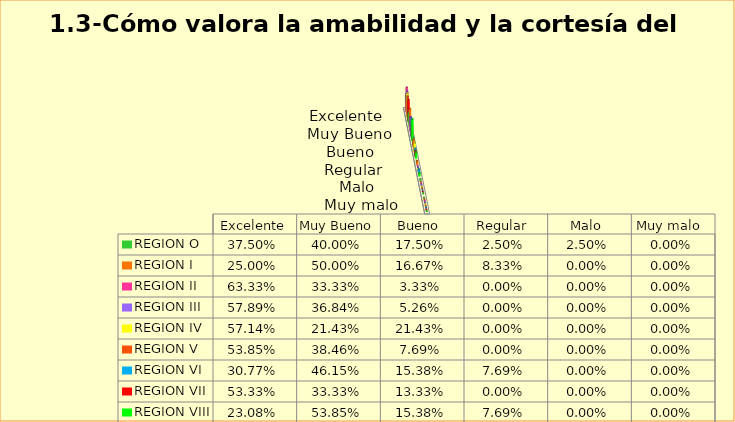
| Category | REGION O | REGION I  | REGION II | REGION III | REGION IV | REGION V  | REGION VI  | REGION VII  | REGION VIII |
|---|---|---|---|---|---|---|---|---|---|
| Excelente | 0.375 | 0.25 | 0.633 | 0.579 | 0.571 | 0.538 | 0.308 | 0.533 | 0.231 |
| Muy Bueno | 0.4 | 0.5 | 0.333 | 0.368 | 0.214 | 0.385 | 0.462 | 0.333 | 0.538 |
| Bueno  | 0.175 | 0.167 | 0.033 | 0.053 | 0.214 | 0.077 | 0.154 | 0.133 | 0.154 |
| Regular  | 0.025 | 0.083 | 0 | 0 | 0 | 0 | 0.077 | 0 | 0.077 |
| Malo  | 0.025 | 0 | 0 | 0 | 0 | 0 | 0 | 0 | 0 |
| Muy malo  | 0 | 0 | 0 | 0 | 0 | 0 | 0 | 0 | 0 |